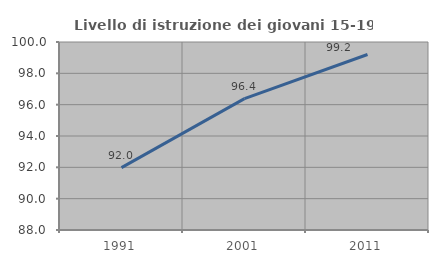
| Category | Livello di istruzione dei giovani 15-19 anni |
|---|---|
| 1991.0 | 91.979 |
| 2001.0 | 96.386 |
| 2011.0 | 99.2 |